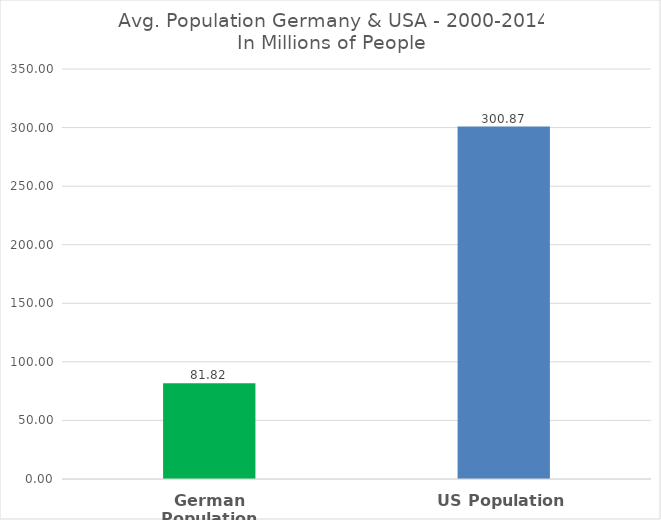
| Category | Series 0 |
|---|---|
| German Population | 81.822 |
| US Population | 300.867 |